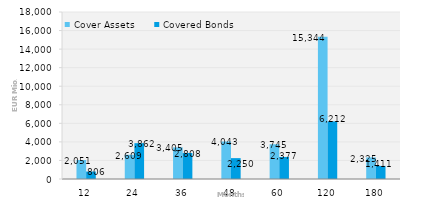
| Category | Cover Assets | Covered Bonds |
|---|---|---|
| 12.0 | 2050.951 | 805.901 |
| 24.0 | 2609.258 | 3862 |
| 36.0 | 3404.672 | 2808 |
| 48.0 | 4043.034 | 2249.5 |
| 60.0 | 3744.777 | 2376.5 |
| 120.0 | 15344.302 | 6211.5 |
| 180.0 | 2325.496 | 1411 |